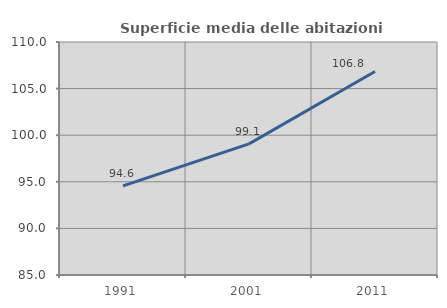
| Category | Superficie media delle abitazioni occupate |
|---|---|
| 1991.0 | 94.562 |
| 2001.0 | 99.066 |
| 2011.0 | 106.836 |